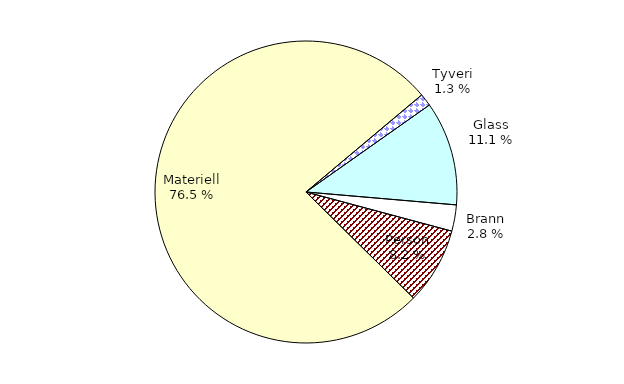
| Category | Series 0 |
|---|---|
| Tyveri | 158.412 |
| Glass | 1318.688 |
| Brann | 332.719 |
| Person | 972.646 |
| Materiell | 9057.562 |